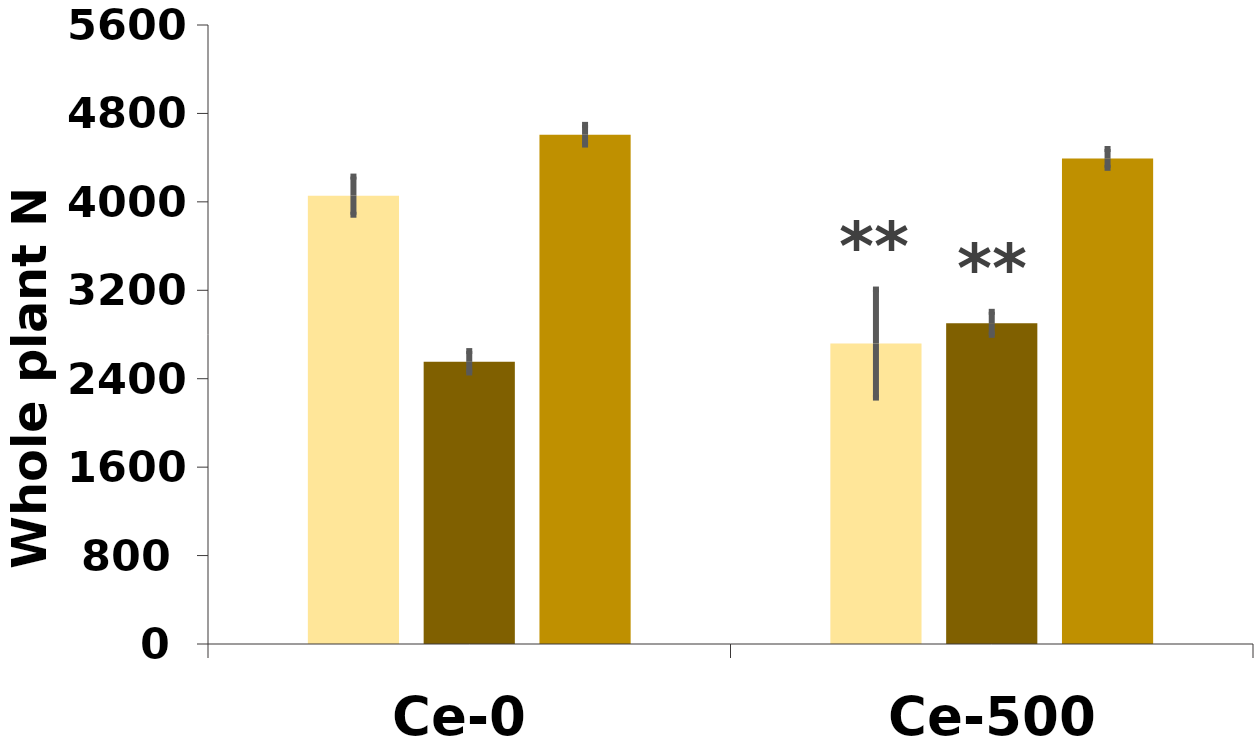
| Category | NH4NO3 | NH4+ | NO3- |
|---|---|---|---|
| Ce-0 | 4056.108 | 2553.201 | 4607.387 |
| Ce-500 | 2718.024 | 2901.143 | 4393.015 |